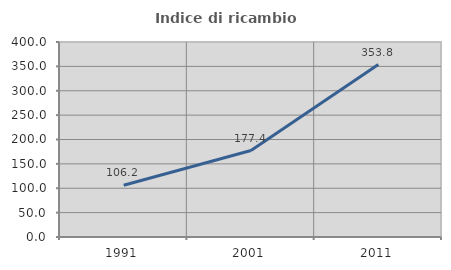
| Category | Indice di ricambio occupazionale  |
|---|---|
| 1991.0 | 106.241 |
| 2001.0 | 177.394 |
| 2011.0 | 353.755 |